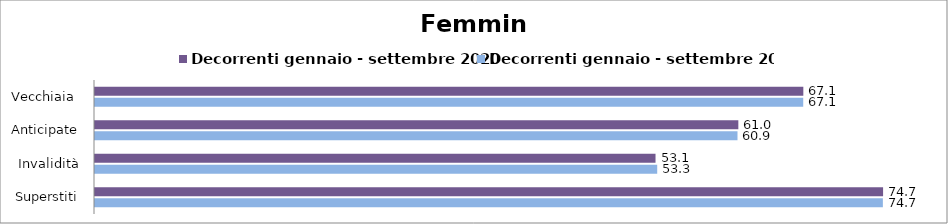
| Category | Decorrenti gennaio - settembre 2020 | Decorrenti gennaio - settembre 2021 |
|---|---|---|
| Vecchiaia  | 67.14 | 67.13 |
| Anticipate | 60.98 | 60.9 |
| Invalidità | 53.13 | 53.29 |
| Superstiti | 74.7 | 74.68 |